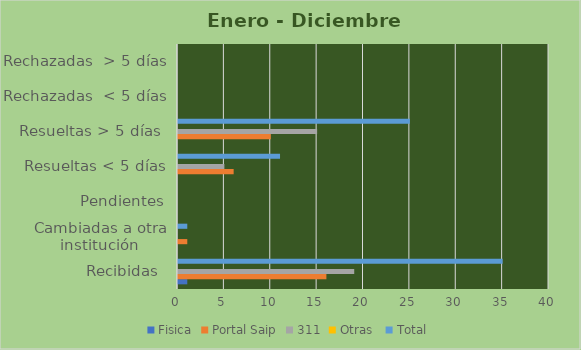
| Category | Fisica | Portal Saip | 311 | Otras  | Total |
|---|---|---|---|---|---|
| Recibidas  | 1 | 16 | 19 | 0 | 35 |
| Cambiadas a otra institución | 0 | 1 | 0 | 0 | 1 |
| Pendientes | 0 | 0 | 0 | 0 | 0 |
| Resueltas < 5 días | 0 | 6 | 5 | 0 | 11 |
| Resueltas > 5 días  | 0 | 10 | 15 | 0 | 25 |
| Rechazadas  < 5 días | 0 | 0 | 0 | 0 | 0 |
| Rechazadas  > 5 días | 0 | 0 | 0 | 0 | 0 |